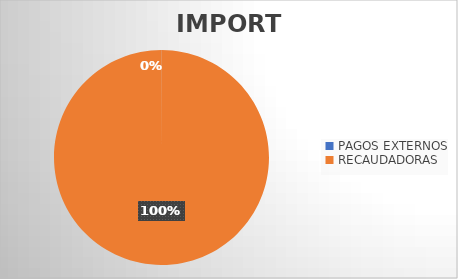
| Category | IMPORTE |
|---|---|
| PAGOS EXTERNOS | 402985.24 |
| RECAUDADORAS | 1200821439.59 |